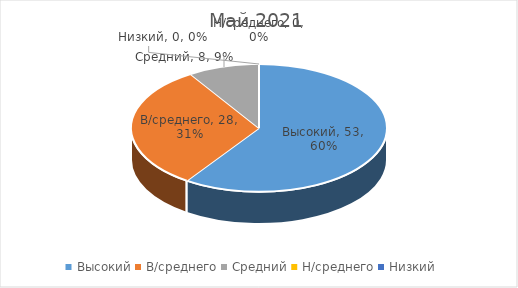
| Category | Май 2021 |
|---|---|
| Высокий | 53 |
| В/среднего | 28 |
| Средний | 8 |
| Н/среднего | 0 |
| Низкий | 0 |